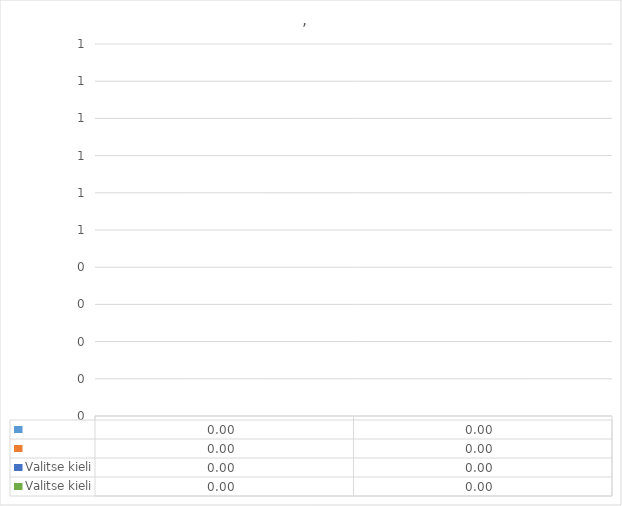
| Category | Series 0 | Series 1 | Valitse kieli |
|---|---|---|---|
| 0 | 0 | 0 | 0 |
| 1 | 0 | 0 | 0 |